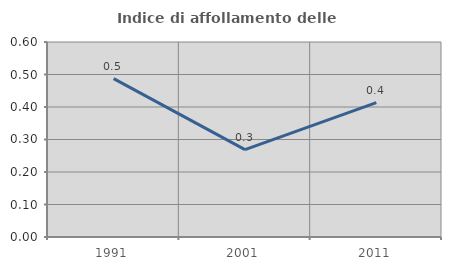
| Category | Indice di affollamento delle abitazioni  |
|---|---|
| 1991.0 | 0.487 |
| 2001.0 | 0.269 |
| 2011.0 | 0.414 |